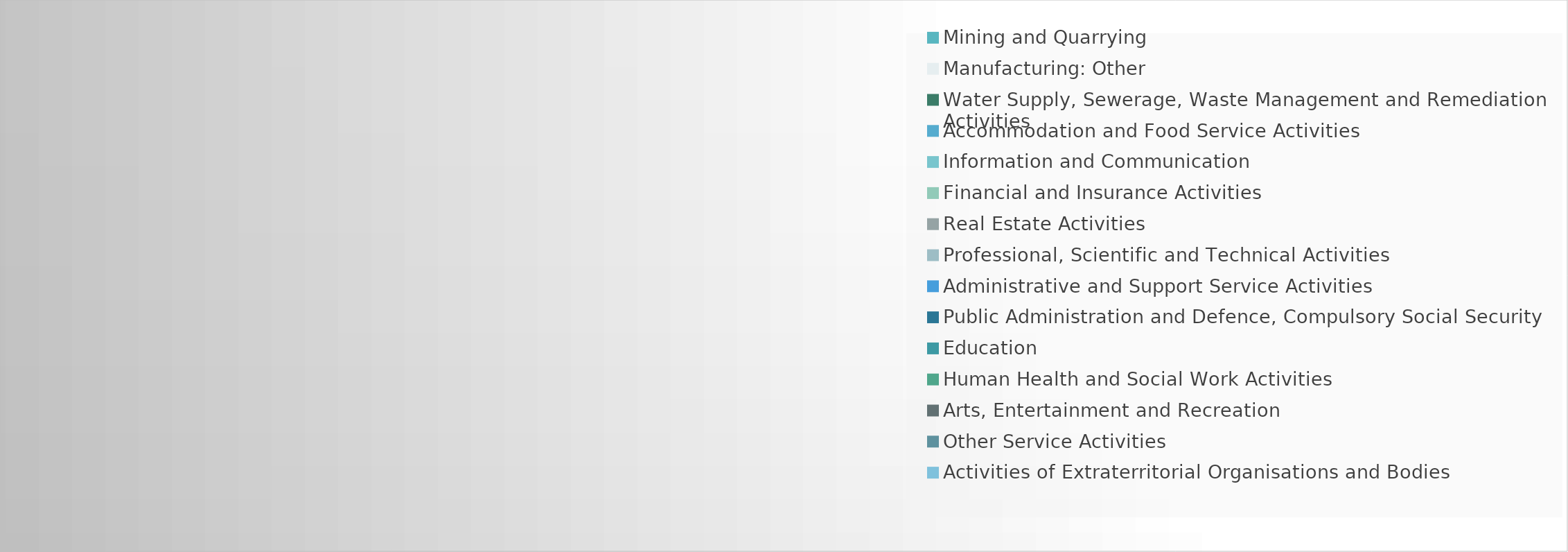
| Category | Series 0 |
|---|---|
| Agriculture, Forestry and Fishing | 2308000 |
| Mining and Quarrying | 76000 |
| Manufacturing: Food, Beverages & Tobaco | 2097000 |
| Manufacturing: Chemicals | 678000 |
| Manufacturing: Rubber and Plastic | 532000 |
| Manufacturing: Metals | 989000 |
| Manufacturing: Other | 155000 |
| Electricity, Gas, Steam and Air Conditioning Supply | 407000 |
| Water Supply, Sewerage, Waste Management and Remediation Activities | 41000 |
| Construction | 1045000 |
| Wholesale and Retail Trade | 541000 |
| Transportation and Storage | 3633000 |
| Accommodation and Food Service Activities | 381000 |
| Information and Communication | 54000 |
| Financial and Insurance Activities | 51000 |
| Real Estate Activities | 114000 |
| Professional, Scientific and Technical Activities | 26000 |
| Administrative and Support Service Activities | 24000 |
| Public Administration and Defence, Compulsory Social Security | 277000 |
| Education | 109000 |
| Human Health and Social Work Activities | 251000 |
| Arts, Entertainment and Recreation | 249000 |
| Other Service Activities | 46000 |
| Activities of Households as Employers | 0 |
| Activities of Extraterritorial Organisations and Bodies | 0 |